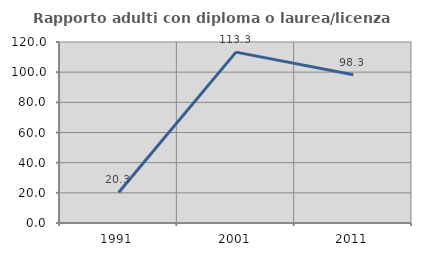
| Category | Rapporto adulti con diploma o laurea/licenza media  |
|---|---|
| 1991.0 | 20.276 |
| 2001.0 | 113.305 |
| 2011.0 | 98.258 |